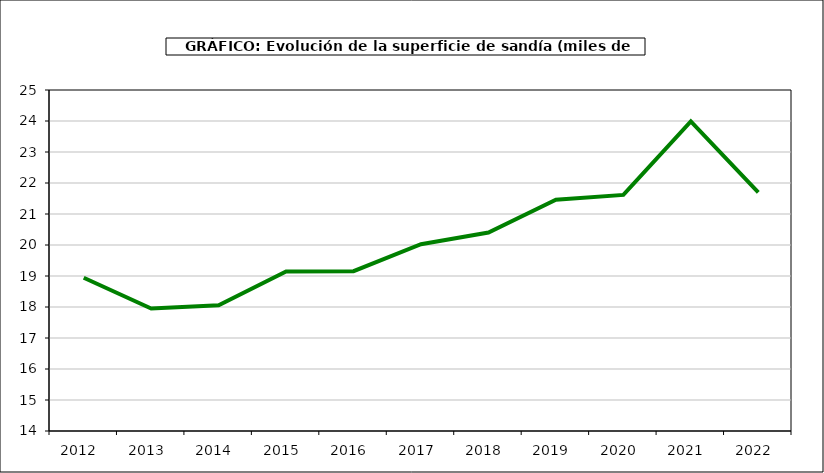
| Category | superficie |
|---|---|
| 2012.0 | 18.942 |
| 2013.0 | 17.953 |
| 2014.0 | 18.059 |
| 2015.0 | 19.147 |
| 2016.0 | 19.156 |
| 2017.0 | 20.026 |
| 2018.0 | 20.401 |
| 2019.0 | 21.459 |
| 2020.0 | 21.617 |
| 2021.0 | 23.986 |
| 2022.0 | 21.695 |